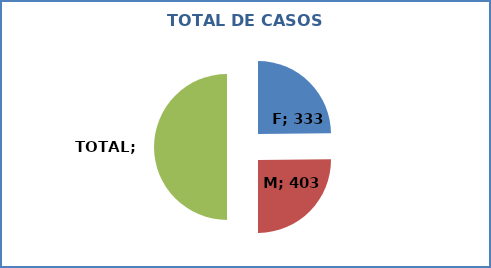
| Category | Series 0 |
|---|---|
| F | 79 |
| M | 80 |
| TOTAL | 159 |